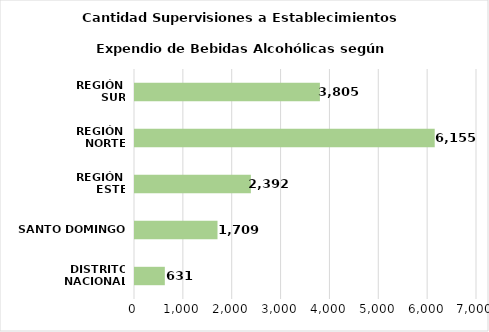
| Category | Series 0 |
|---|---|
| DISTRITO NACIONAL | 631 |
| SANTO DOMINGO | 1709 |
| REGIÓN 
ESTE | 2392 |
| REGIÓN 
NORTE | 6155 |
| REGIÓN 
SUR | 3805 |